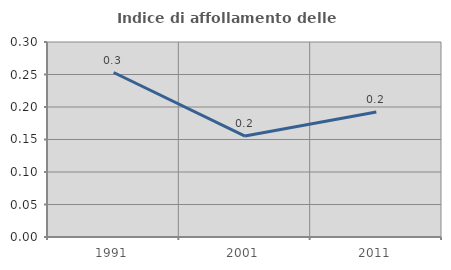
| Category | Indice di affollamento delle abitazioni  |
|---|---|
| 1991.0 | 0.253 |
| 2001.0 | 0.155 |
| 2011.0 | 0.192 |